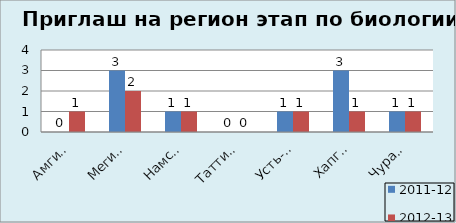
| Category | 2011-12 | 2012-13 |
|---|---|---|
| Амгинский | 0 | 1 |
| Мегино-Кангаласс | 3 | 2 |
| Намский | 1 | 1 |
| Таттинский | 0 | 0 |
| Усть-Алданский | 1 | 1 |
| Хапгаласский | 3 | 1 |
| Чурапчинский | 1 | 1 |